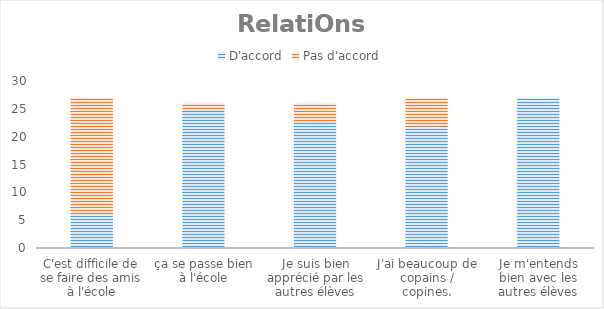
| Category | D'accord | Pas d'accord |
|---|---|---|
| C'est difficile de se faire des amis à l'école | 6 | 21 |
| ça se passe bien à l'école | 25 | 1 |
| Je suis bien apprécié par les autres élèves | 23 | 3 |
| J'ai beaucoup de copains / copines. | 22 | 5 |
| Je m'entends bien avec les autres élèves | 27 | 0 |